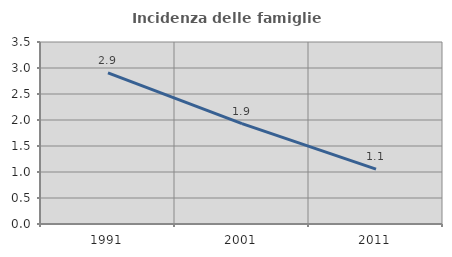
| Category | Incidenza delle famiglie numerose |
|---|---|
| 1991.0 | 2.906 |
| 2001.0 | 1.929 |
| 2011.0 | 1.054 |